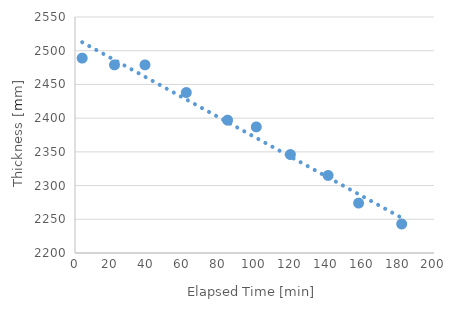
| Category | Series 0 |
|---|---|
| 4.0 | 2489 |
| 22.0 | 2479 |
| 39.0 | 2479 |
| 62.0 | 2438 |
| 85.0 | 2397 |
| 101.0 | 2387 |
| 120.0 | 2346 |
| 141.0 | 2315 |
| 158.0 | 2274 |
| 182.0 | 2243 |